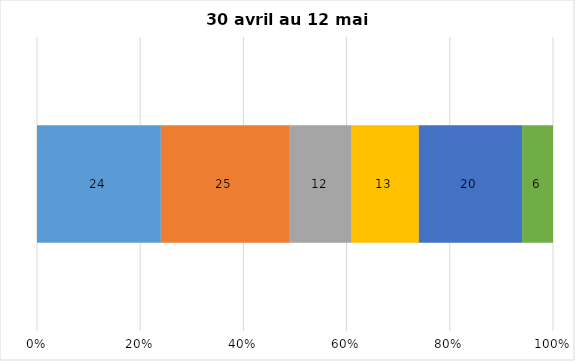
| Category | Plusieurs fois par jour | Une fois par jour | Quelques fois par semaine   | Une fois par semaine ou moins   |  Jamais   |  Je n’utilise pas les médias sociaux |
|---|---|---|---|---|---|---|
| 0 | 24 | 25 | 12 | 13 | 20 | 6 |